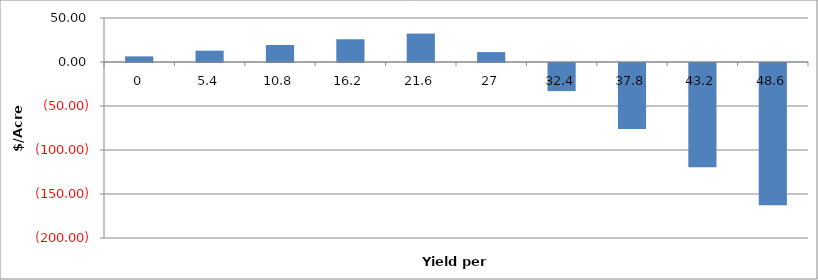
| Category | Series 0 |
|---|---|
| 0.0 | 6.393 |
| 5.4 | 12.873 |
| 10.8 | 19.353 |
| 16.2 | 25.833 |
| 21.6 | 32.313 |
| 27.0 | 11.262 |
| 32.4 | -31.938 |
| 37.8 | -75.138 |
| 43.2 | -118.338 |
| 48.6 | -161.538 |